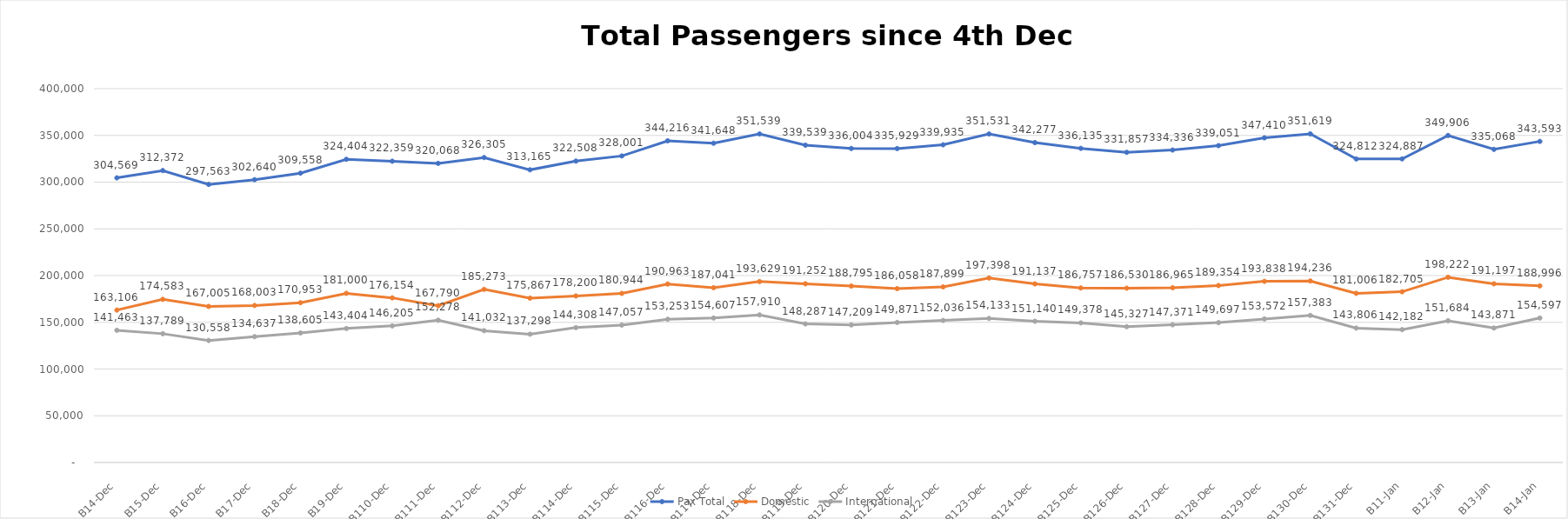
| Category | Pax Total |  Domestic  |  International  |
|---|---|---|---|
| 2022-12-04 | 304569 | 163106 | 141463 |
| 2022-12-05 | 312372 | 174583 | 137789 |
| 2022-12-06 | 297563 | 167005 | 130558 |
| 2022-12-07 | 302640 | 168003 | 134637 |
| 2022-12-08 | 309558 | 170953 | 138605 |
| 2022-12-09 | 324404 | 181000 | 143404 |
| 2022-12-10 | 322359 | 176154 | 146205 |
| 2022-12-11 | 320068 | 167790 | 152278 |
| 2022-12-12 | 326305 | 185273 | 141032 |
| 2022-12-13 | 313165 | 175867 | 137298 |
| 2022-12-14 | 322508 | 178200 | 144308 |
| 2022-12-15 | 328001 | 180944 | 147057 |
| 2022-12-16 | 344216 | 190963 | 153253 |
| 2022-12-17 | 341648 | 187041 | 154607 |
| 2022-12-18 | 351539 | 193629 | 157910 |
| 2022-12-19 | 339539 | 191252 | 148287 |
| 2022-12-20 | 336004 | 188795 | 147209 |
| 2022-12-21 | 335929 | 186058 | 149871 |
| 2022-12-22 | 339935 | 187899 | 152036 |
| 2022-12-23 | 351531 | 197398 | 154133 |
| 2022-12-24 | 342277 | 191137 | 151140 |
| 2022-12-25 | 336135 | 186757 | 149378 |
| 2022-12-26 | 331857 | 186530 | 145327 |
| 2022-12-27 | 334336 | 186965 | 147371 |
| 2022-12-28 | 339051 | 189354 | 149697 |
| 2022-12-29 | 347410 | 193838 | 153572 |
| 2022-12-30 | 351619 | 194236 | 157383 |
| 2022-12-31 | 324812 | 181006 | 143806 |
| 2023-01-01 | 324887 | 182705 | 142182 |
| 2023-01-02 | 349906 | 198222 | 151684 |
| 2023-01-03 | 335068 | 191197 | 143871 |
| 2023-01-04 | 343593 | 188996 | 154597 |